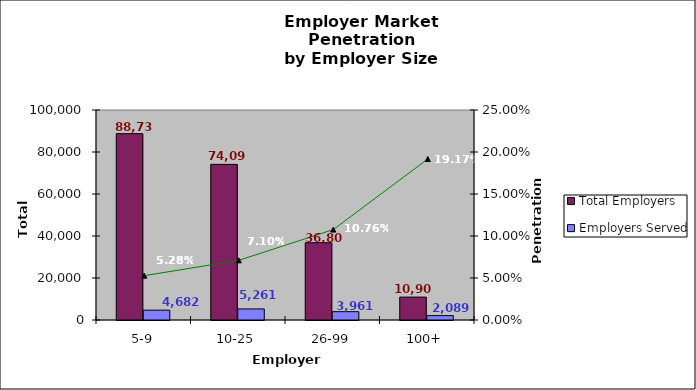
| Category | Total Employers | Employers Served |
|---|---|---|
| 5-9 | 88730 | 4682 |
| 10-25 | 74093 | 5261 |
| 26-99 | 36806 | 3961 |
| 100+ | 10900 | 2089 |